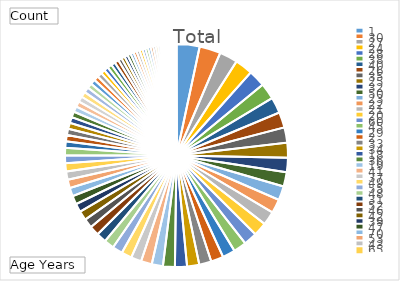
| Category | Total |
|---|---|
| 1 | 140 |
| 30 | 129 |
| 27 | 110 |
| 24 | 108 |
| 28 | 102 |
| 38 | 98 |
| 40 | 97 |
| 26 | 94 |
| 35 | 93 |
| 25 | 91 |
| 32 | 87 |
| 50 | 87 |
| 23 | 85 |
| 22 | 85 |
| 21 | 83 |
| 20 | 83 |
| 60 | 81 |
| 45 | 79 |
| 29 | 77 |
| 2 | 76 |
| 33 | 74 |
| 34 | 74 |
| 18 | 73 |
| 36 | 72 |
| 19 | 68 |
| 41 | 66 |
| 37 | 63 |
| 49 | 63 |
| 55 | 62 |
| 48 | 61 |
| 31 | 60 |
| 52 | 59 |
| 46 | 56 |
| 42 | 56 |
| 39 | 52 |
| 47 | 52 |
| 70 | 51 |
| 53 | 51 |
| 43 | 50 |
| 65 | 50 |
| 54 | 47 |
| 16 | 46 |
| 17 | 39 |
| 44 | 38 |
| 51 | 38 |
| 3 | 37 |
| 4 | 36 |
| 57 | 35 |
| 56 | 34 |
| 62 | 34 |
| 63 | 33 |
| 6 | 33 |
| 58 | 33 |
| 15 | 30 |
| 59 | 30 |
| 5 | 29 |
| 14 | 29 |
| 80 | 26 |
| 68 | 26 |
| 0 | 26 |
| 64 | 25 |
| 61 | 25 |
| 75 | 22 |
| 7 | 21 |
| 13 | 20 |
| 12 | 20 |
| 72 | 19 |
| 9 | 19 |
| 10 | 19 |
| 67 | 19 |
| 74 | 17 |
| 76 | 17 |
| 66 | 16 |
| 8 | 16 |
| 69 | 15 |
| 71 | 14 |
| 73 | 13 |
| 78 | 12 |
| 11 | 11 |
| 85 | 11 |
| 90 | 9 |
| 83 | 7 |
| 77 | 7 |
| 79 | 5 |
| 89 | 4 |
| 82 | 4 |
| 100 | 3 |
| 102 | 3 |
| 84 | 3 |
| 86 | 3 |
| 81 | 3 |
| 120 | 2 |
| 95 | 2 |
| 103 | 1 |
| 118 | 1 |
| 91 | 1 |
| 97 | 1 |
| 115 | 1 |
| 98 | 1 |
| 119 | 1 |
| 99 | 1 |
| 87 | 1 |
| 92 | 1 |